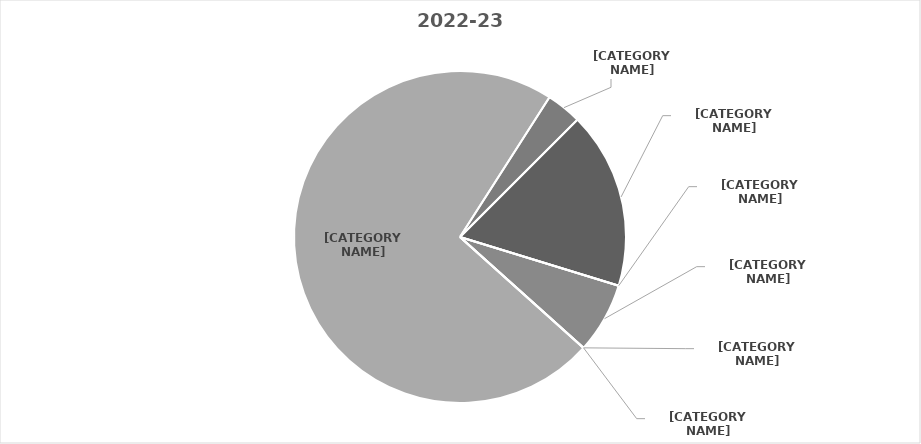
| Category | 2022-23 |
|---|---|
| Domestic Not Supplied | 5 |
| American Indian/ Alaskan Native | 0 |
| African American/ Non Hispanic | 2 |
| Asian/ Asian American** | 0 |
| Hispanic/ Hispanic American | 0 |
| White/ Non Hispanic | 21 |
| Multi Racial | 1 |